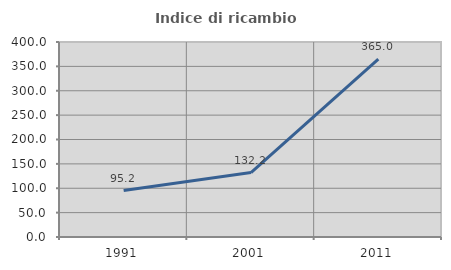
| Category | Indice di ricambio occupazionale  |
|---|---|
| 1991.0 | 95.238 |
| 2001.0 | 132.164 |
| 2011.0 | 365 |